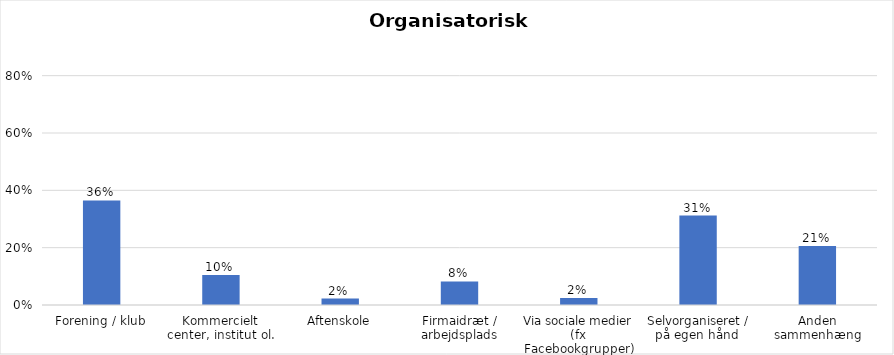
| Category | % |
|---|---|
| Forening / klub | 0.365 |
| Kommercielt center, institut ol. | 0.105 |
| Aftenskole | 0.023 |
| Firmaidræt / arbejdsplads | 0.082 |
| Via sociale medier (fx Facebookgrupper) | 0.024 |
| Selvorganiseret / på egen hånd  | 0.312 |
| Anden sammenhæng | 0.206 |